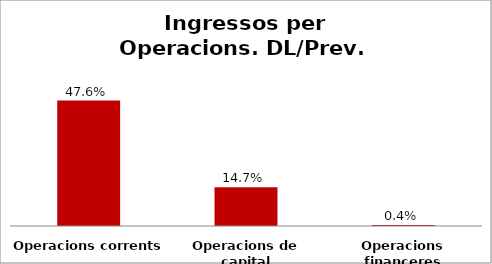
| Category | Series 0 |
|---|---|
| Operacions corrents | 0.476 |
| Operacions de capital | 0.147 |
| Operacions financeres | 0.004 |